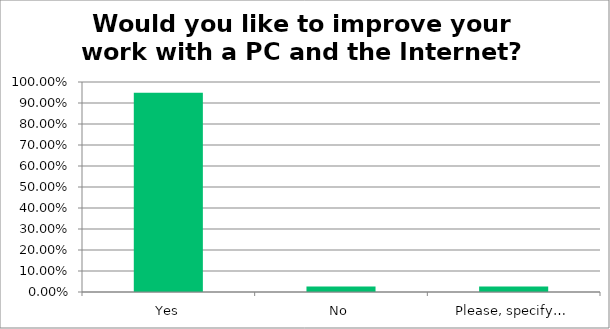
| Category | Responses |
|---|---|
| Yes | 0.949 |
| No | 0.026 |
| Please, specify… | 0.026 |